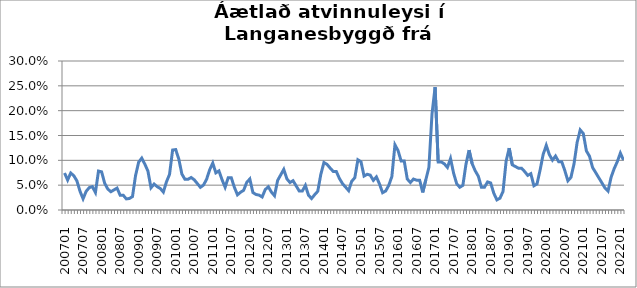
| Category | Series 0 |
|---|---|
| 200701 | 0.074 |
| 200702 | 0.06 |
| 200703 | 0.074 |
| 200704 | 0.069 |
| 200705 | 0.059 |
| 200706 | 0.038 |
| 200707 | 0.023 |
| 200708 | 0.038 |
| 200709 | 0.045 |
| 200710 | 0.047 |
| 200711 | 0.035 |
| 200712 | 0.078 |
| 200801 | 0.077 |
| 200802 | 0.054 |
| 200803 | 0.042 |
| 200804 | 0.037 |
| 200805 | 0.04 |
| 200806 | 0.044 |
| 200807 | 0.03 |
| 200808 | 0.03 |
| 200809 | 0.022 |
| 200810 | 0.023 |
| 200811 | 0.027 |
| 200812 | 0.069 |
| 200901 | 0.096 |
| 200902 | 0.104 |
| 200903 | 0.092 |
| 200904 | 0.078 |
| 200905 | 0.045 |
| 200906 | 0.052 |
| 200907 | 0.047 |
| 200908 | 0.043 |
| 200909 | 0.036 |
| 200910 | 0.057 |
| 200911 | 0.072 |
| 200912 | 0.121 |
| 201001 | 0.122 |
| 201002 | 0.103 |
| 201003 | 0.072 |
| 201004 | 0.062 |
| 201005 | 0.062 |
| 201006 | 0.065 |
| 201007 | 0.061 |
| 201008 | 0.053 |
| 201009 | 0.046 |
| 201010 | 0.05 |
| 201011 | 0.062 |
| 201012 | 0.081 |
| 201101 | 0.094 |
| 201102 | 0.075 |
| 201103 | 0.079 |
| 201104 | 0.061 |
| 201105 | 0.046 |
| 201106 | 0.065 |
| 201107 | 0.065 |
| 201108 | 0.046 |
| 201109 | 0.031 |
| 201110 | 0.036 |
| 201111 | 0.04 |
| 201112 | 0.056 |
| 201201 | 0.062 |
| 201202 | 0.035 |
| 201203 | 0.031 |
| 201204 | 0.03 |
| 201205 | 0.026 |
| 201206 | 0.041 |
| 201207 | 0.047 |
| 201208 | 0.036 |
| 201209 | 0.029 |
| 201210 | 0.059 |
| 201211 | 0.071 |
| 201212 | 0.082 |
| 201301 | 0.063 |
| 201302 | 0.055 |
| 201303 | 0.059 |
| 201304 | 0.049 |
| 201305 | 0.038 |
| 201306 | 0.038 |
| 201307 | 0.05 |
| 201308 | 0.03 |
| 201309 | 0.023 |
| 201310 | 0.031 |
| 201311 | 0.038 |
| 201312 | 0.072 |
| 201401 | 0.096 |
| 201402 | 0.092 |
| 201403 | 0.085 |
| 201404 | 0.078 |
| 201405 | 0.078 |
| 201406 | 0.064 |
| 201407 | 0.053 |
| 201408 | 0.046 |
| 201409 | 0.039 |
| 201410 | 0.058 |
| 201411 | 0.065 |
| 201412 | 0.101 |
| 201501 | 0.097 |
| 201502 | 0.068 |
| 201503 | 0.072 |
| 201504 | 0.07 |
| 201505 | 0.06 |
| 201506 | 0.067 |
| 201507 | 0.052 |
| 201508 | 0.035 |
| 201509 | 0.038 |
| 201510 | 0.05 |
| 201511 | 0.067 |
| 201512 | 0.131 |
| 201601 | 0.12 |
| 201602 | 0.099 |
| 201603 | 0.099 |
| 201604 | 0.062 |
| 201605 | 0.055 |
| 201606 | 0.062 |
| 201607 | 0.06 |
| 201608 | 0.06 |
| 201609 | 0.035 |
| 201610 | 0.061 |
| 201611 | 0.086 |
| 201612 | 0.194 |
| 201701 | 0.247 |
| 201702 | 0.097 |
| 201703 | 0.097 |
| 201704 | 0.093 |
| 201705 | 0.086 |
| 201706 | 0.104 |
| 201707 | 0.074 |
| 201708 | 0.053 |
| 201709 | 0.046 |
| 201710 | 0.05 |
| 201711 | 0.092 |
| 201712 | 0.121 |
| 201801 | 0.093 |
| 201802 | 0.079 |
| 201803 | 0.068 |
| 201804 | 0.046 |
| 201805 | 0.046 |
| 201806 | 0.057 |
| 201807 | 0.054 |
| 201808 | 0.034 |
| 201809 | 0.02 |
| 201810 | 0.024 |
| 201811 | 0.037 |
| 201812 | 0.098 |
| 201901 | 0.125 |
| 201902 | 0.091 |
| 201903 | 0.088 |
| 201904 | 0.084 |
| 201905 | 0.084 |
| 201906 | 0.077 |
| 201907 | 0.07 |
| 201908 | 0.073 |
| 201909 | 0.049 |
| 201910 | 0.052 |
| 201911 | 0.08 |
| 201912 | 0.112 |
| 202001 | 0.13 |
| 202002 | 0.112 |
| 202003 | 0.1 |
| 202004 | 0.109 |
| 202005 | 0.097 |
| 202006 | 0.097 |
| 202007 | 0.08 |
| 202008 | 0.059 |
| 202009 | 0.066 |
| 202010 | 0.093 |
| 202011 | 0.136 |
| 202012 | 0.161 |
| 202101 | 0.154 |
| 202102 | 0.119 |
| 202103 | 0.108 |
| 202104 | 0.086 |
| 202105 | 0.075 |
| 202106 | 0.065 |
| 202107 | 0.055 |
| 202108 | 0.045 |
| 202109 | 0.038 |
| 202110 | 0.066 |
| 202111 | 0.083 |
| 202112 | 0.097 |
| 202201 | 0.115 |
| 202202 | 0.101 |